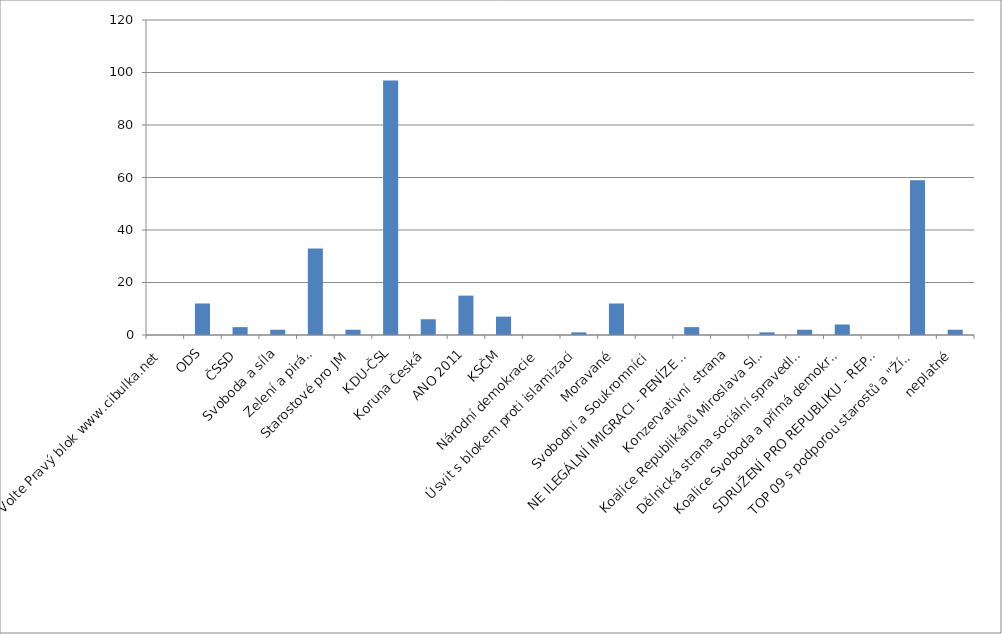
| Category | Series 0 |
|---|---|
| Volte Pravý blok www.cibulka.net | 0 |
| ODS | 12 |
| ČSSD | 3 |
| Svoboda a síla | 2 |
| Zelení a piráti | 33 |
| Starostové pro JM | 2 |
| KDU-ČSL | 97 |
| Koruna Česká | 6 |
| ANO 2011 | 15 |
| KSČM | 7 |
| Národní demokracie | 0 |
| Úsvit s blokem proti islamizaci | 1 |
| Moravané | 12 |
| Svobodní a Soukromníci | 0 |
| NE ILEGÁLNÍ IMIGRACI - PENÍZE RADĚJI PRO NAŠE LIDI | 3 |
| Konzervativní  strana | 0 |
| Koalice Republikánů Miroslava Sládka, Patriotů České republiky a HOZK | 1 |
| Dělnická strana sociální spravedlnosti - Imigranty a islám v ČR nechceme! | 2 |
| Koalice Svoboda a přímá demokracie - Tomio Okamura (SPD) a Strana Práv Občanů | 4 |
| SDRUŽENÍ PRO REPUBLIKU - REPUBLIKÁNSKÁ STRANA ČECH, MORAVY A SLEZSKA | 0 |
| TOP 09 s podporou starostů a "Žít Brno" | 59 |
| neplatné | 2 |